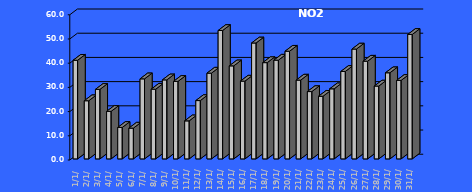
| Category | NO2 [µg/m3] |
|---|---|
| 2023-01-01 | 40.748 |
| 2023-01-02 | 24.024 |
| 2023-01-03 | 28.718 |
| 2023-01-04 | 19.621 |
| 2023-01-05 | 12.989 |
| 2023-01-06 | 12.711 |
| 2023-01-07 | 33.069 |
| 2023-01-08 | 28.799 |
| 2023-01-09 | 32.637 |
| 2023-01-10 | 32.018 |
| 2023-01-11 | 15.71 |
| 2023-01-12 | 24.095 |
| 2023-01-13 | 35.424 |
| 2023-01-14 | 53.045 |
| 2023-01-15 | 38.433 |
| 2023-01-16 | 32.124 |
| 2023-01-17 | 47.884 |
| 2023-01-18 | 39.768 |
| 2023-01-19 | 40.788 |
| 2023-01-20 | 44.479 |
| 2023-01-21 | 32.548 |
| 2023-01-22 | 27.81 |
| 2023-01-23 | 25.866 |
| 2023-01-24 | 28.946 |
| 2023-01-25 | 36.129 |
| 2023-01-26 | 45.383 |
| 2023-01-27 | 40.366 |
| 2023-01-28 | 30.09 |
| 2023-01-29 | 35.575 |
| 2023-01-30 | 32.419 |
| 2023-01-31 | 51.408 |